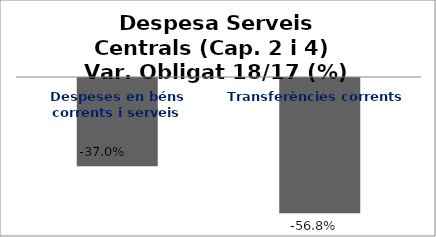
| Category | Series 0 |
|---|---|
| Despeses en béns corrents i serveis | -0.37 |
| Transferències corrents | -0.568 |